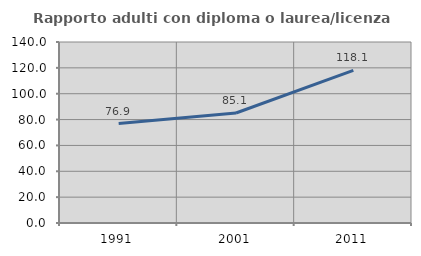
| Category | Rapporto adulti con diploma o laurea/licenza media  |
|---|---|
| 1991.0 | 76.923 |
| 2001.0 | 85.075 |
| 2011.0 | 118.072 |